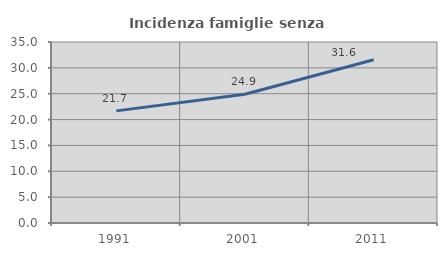
| Category | Incidenza famiglie senza nuclei |
|---|---|
| 1991.0 | 21.683 |
| 2001.0 | 24.898 |
| 2011.0 | 31.58 |